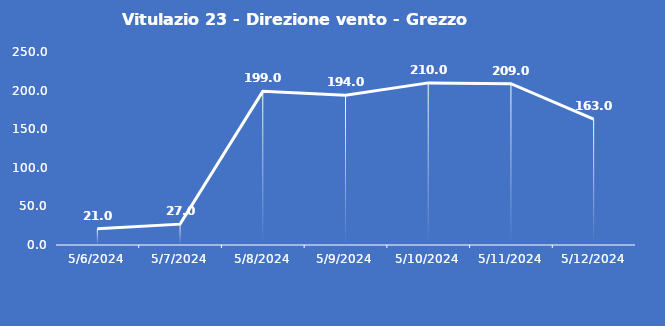
| Category | Vitulazio 23 - Direzione vento - Grezzo (°N) |
|---|---|
| 5/6/24 | 21 |
| 5/7/24 | 27 |
| 5/8/24 | 199 |
| 5/9/24 | 194 |
| 5/10/24 | 210 |
| 5/11/24 | 209 |
| 5/12/24 | 163 |